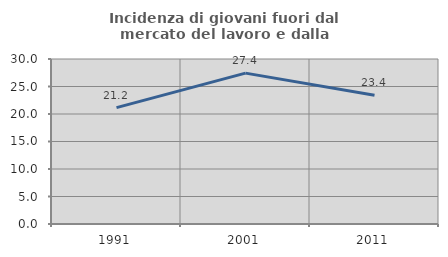
| Category | Incidenza di giovani fuori dal mercato del lavoro e dalla formazione  |
|---|---|
| 1991.0 | 21.161 |
| 2001.0 | 27.435 |
| 2011.0 | 23.427 |